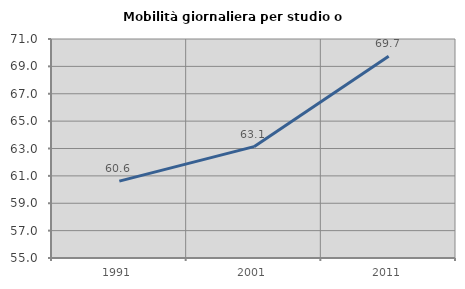
| Category | Mobilità giornaliera per studio o lavoro |
|---|---|
| 1991.0 | 60.618 |
| 2001.0 | 63.135 |
| 2011.0 | 69.739 |